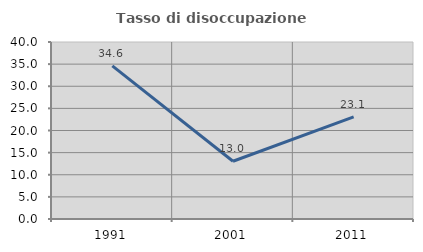
| Category | Tasso di disoccupazione giovanile  |
|---|---|
| 1991.0 | 34.615 |
| 2001.0 | 13.043 |
| 2011.0 | 23.077 |